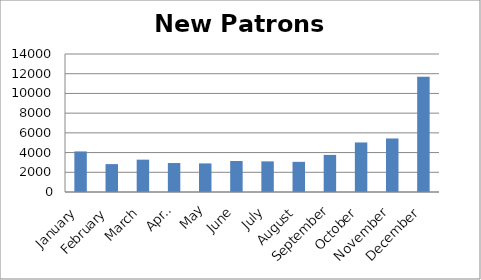
| Category | Series 0 |
|---|---|
| January | 4116 |
| February | 2830 |
| March | 3281 |
| April | 2939 |
| May | 2900 |
| June | 3143 |
| July | 3109 |
| August | 3059 |
| September | 3764 |
| October | 5026 |
| November | 5430 |
| December | 11690 |